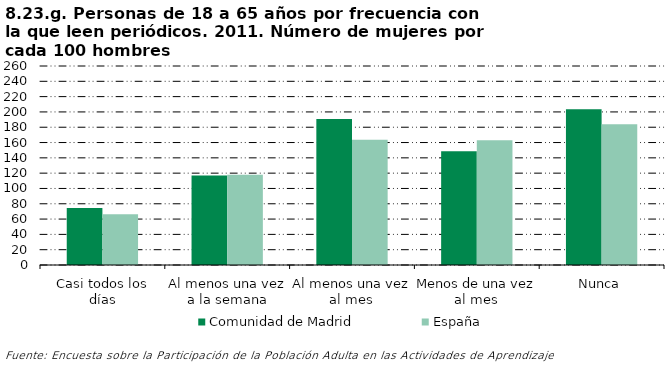
| Category | Comunidad de Madrid | España |
|---|---|---|
| Casi todos los días | 74.633 | 66.327 |
| Al menos una vez a la semana | 117.066 | 118.078 |
| Al menos una vez al mes | 190.705 | 163.676 |
| Menos de una vez al mes | 148.699 | 162.987 |
| Nunca | 203.342 | 183.764 |